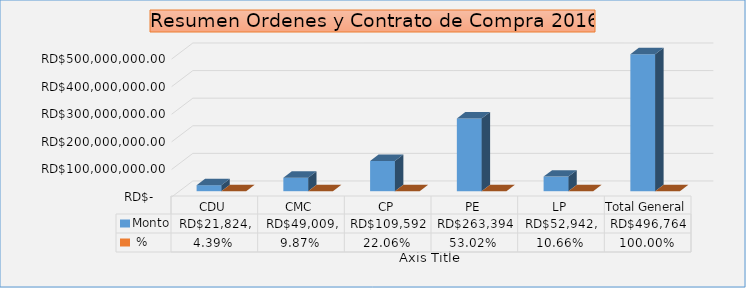
| Category | Monto |  % |
|---|---|---|
| CDU | 21824965.74 | 0.044 |
| CMC | 49009221.84 | 0.099 |
| CP | 109592727.96 | 0.221 |
| PE | 263394966.32 | 0.53 |
| LP | 52942204.89 | 0.107 |
| Total General | 496764086.75 | 1 |